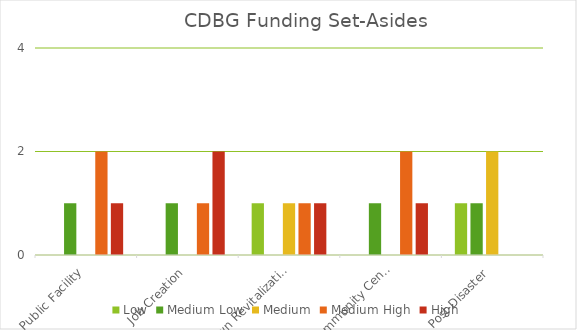
| Category | Low | Medium Low | Medium | Medium High | High |
|---|---|---|---|---|---|
| Public Facility | 0 | 1 | 0 | 2 | 1 |
| Job Creation | 0 | 1 | 0 | 1 | 2 |
| Downtown Revitalization | 1 | 0 | 1 | 1 | 1 |
| Senior/Community Center and Parks | 0 | 1 | 0 | 2 | 1 |
| Post-Disaster | 1 | 1 | 2 | 0 | 0 |